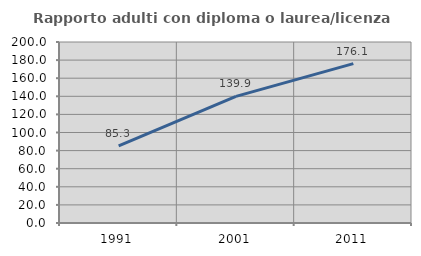
| Category | Rapporto adulti con diploma o laurea/licenza media  |
|---|---|
| 1991.0 | 85.297 |
| 2001.0 | 139.894 |
| 2011.0 | 176.119 |